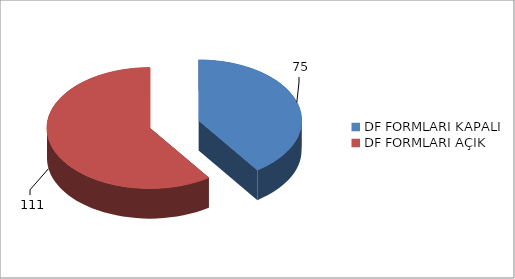
| Category | Series 0 |
|---|---|
| 0 | 75 |
| 1 | 111 |